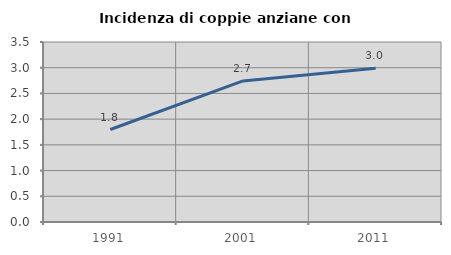
| Category | Incidenza di coppie anziane con figli |
|---|---|
| 1991.0 | 1.799 |
| 2001.0 | 2.744 |
| 2011.0 | 2.989 |